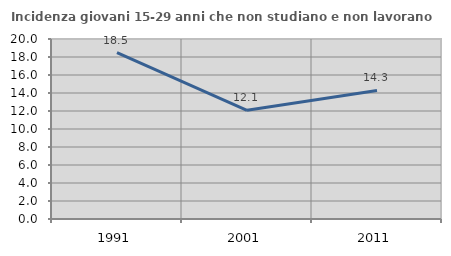
| Category | Incidenza giovani 15-29 anni che non studiano e non lavorano  |
|---|---|
| 1991.0 | 18.496 |
| 2001.0 | 12.083 |
| 2011.0 | 14.286 |